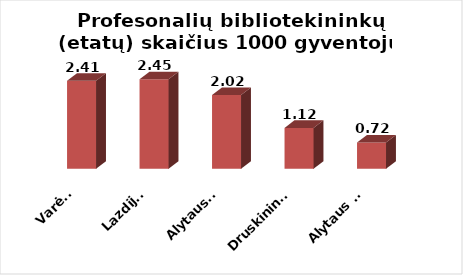
| Category | Series 0 |
|---|---|
| Varėna | 2.41 |
| Lazdijai | 2.45 |
| Alytaus r. | 2.02 |
| Druskininkai | 1.12 |
| Alytaus m. | 0.72 |